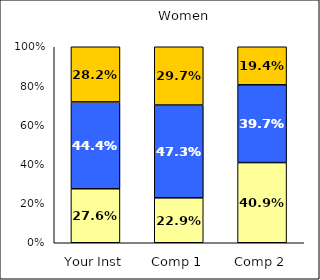
| Category | Low Academic Self-Concept | Average Academic Self-Concept | High Academic Self-Concept |
|---|---|---|---|
| Your Inst | 0.276 | 0.444 | 0.282 |
| Comp 1 | 0.229 | 0.473 | 0.297 |
| Comp 2 | 0.409 | 0.397 | 0.194 |